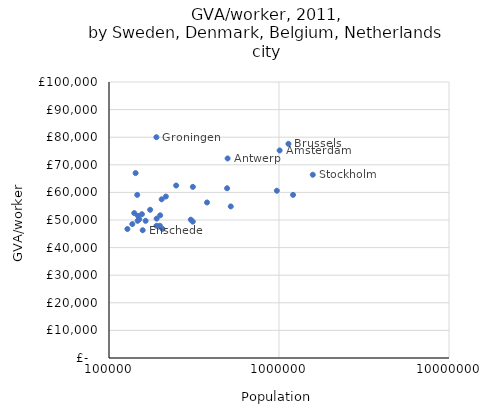
| Category | GVA per worker 2011 (£) |
|---|---|
| 189991.0 | 80000 |
| 1136778.0 | 77600 |
| 1008544.0 | 75200 |
| 498473.0 | 72300 |
| 143374.0 | 67000 |
| 1579896.0 | 66400 |
| 248358.0 | 62500 |
| 311367.0 | 62000 |
| 495083.0 | 61500 |
| 971178.0 | 60600 |
| 146592.0 | 59100 |
| 1209627.0 | 59100 |
| 216036.0 | 58500 |
| 204150.0 | 57500 |
| 377263.0 | 56347.17 |
| 520374.0 | 54916.63 |
| 174599.0 | 53700 |
| 140786.0 | 52500 |
| 156199.0 | 52100 |
| 200001.0 | 51700 |
| 148070.0 | 51500 |
| 190655.0 | 50500 |
| 150670.0 | 50300 |
| 302835.0 | 50107.63 |
| 147334.0 | 49711.13 |
| 164223.0 | 49700 |
| 310956.0 | 49409.23 |
| 137121.0 | 48527 |
| 199188.0 | 47900 |
| 190245.0 | 47900 |
| 206240.0 | 46800 |
| 128305.0 | 46736.47 |
| 157838.0 | 46300 |